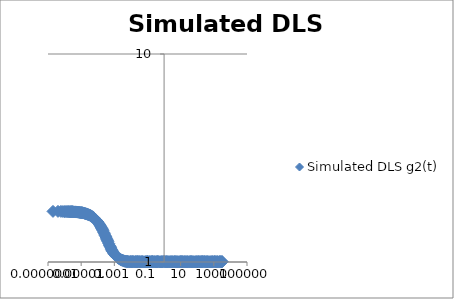
| Category | Simulated DLS g2(t) |
|---|---|
| 0.0 | 1.75 |
| 2e-07 | 1.751 |
| 4e-07 | 1.752 |
| 6e-07 | 1.751 |
| 8e-07 | 1.749 |
| 1e-06 | 1.747 |
| 1.2e-06 | 1.748 |
| 1.4e-06 | 1.747 |
| 1.6e-06 | 1.747 |
| 1.8e-06 | 1.747 |
| 2e-06 | 1.745 |
| 2.2e-06 | 1.744 |
| 2.4e-06 | 1.746 |
| 2.6e-06 | 1.745 |
| 2.8e-06 | 1.745 |
| 3e-06 | 1.744 |
| 3.2e-06 | 1.744 |
| 3.6e-06 | 1.741 |
| 4e-06 | 1.74 |
| 4.4e-06 | 1.741 |
| 4.8e-06 | 1.741 |
| 5.2e-06 | 1.739 |
| 5.6e-06 | 1.739 |
| 6e-06 | 1.738 |
| 6.4e-06 | 1.736 |
| 7.2e-06 | 1.734 |
| 8e-06 | 1.731 |
| 8.8e-06 | 1.729 |
| 9.6e-06 | 1.728 |
| 1.04e-05 | 1.727 |
| 1.12e-05 | 1.726 |
| 1.2e-05 | 1.725 |
| 1.28e-05 | 1.721 |
| 1.44e-05 | 1.719 |
| 1.6e-05 | 1.714 |
| 1.76e-05 | 1.71 |
| 1.92e-05 | 1.706 |
| 2.08e-05 | 1.703 |
| 2.24e-05 | 1.701 |
| 2.4e-05 | 1.696 |
| 2.56e-05 | 1.694 |
| 2.88e-05 | 1.686 |
| 3.2e-05 | 1.681 |
| 3.52e-05 | 1.675 |
| 3.84e-05 | 1.668 |
| 4.16e-05 | 1.661 |
| 4.48e-05 | 1.654 |
| 4.8e-05 | 1.649 |
| 5.12e-05 | 1.641 |
| 5.76e-05 | 1.631 |
| 6.4e-05 | 1.619 |
| 7.04e-05 | 1.606 |
| 7.68e-05 | 1.593 |
| 8.32e-05 | 1.585 |
| 8.96e-05 | 1.574 |
| 9.6e-05 | 1.564 |
| 0.0001024 | 1.554 |
| 0.0001152 | 1.533 |
| 0.000128 | 1.515 |
| 0.0001408 | 1.495 |
| 0.0001536 | 1.476 |
| 0.0001664 | 1.46 |
| 0.0001792 | 1.447 |
| 0.000192 | 1.431 |
| 0.0002048 | 1.415 |
| 0.0002304 | 1.387 |
| 0.000256 | 1.365 |
| 0.0002816 | 1.341 |
| 0.0003072 | 1.321 |
| 0.0003328 | 1.302 |
| 0.0003584 | 1.284 |
| 0.000384 | 1.268 |
| 0.0004096 | 1.253 |
| 0.0004608 | 1.226 |
| 0.000512 | 1.202 |
| 0.0005632 | 1.185 |
| 0.0006144 | 1.169 |
| 0.0006656 | 1.152 |
| 0.0007168 | 1.138 |
| 0.000768 | 1.127 |
| 0.0008192 | 1.117 |
| 0.0009216 | 1.101 |
| 0.001024 | 1.088 |
| 0.0011264 | 1.081 |
| 0.0012288 | 1.071 |
| 0.0013312 | 1.064 |
| 0.0014336 | 1.058 |
| 0.001536 | 1.053 |
| 0.0016384 | 1.049 |
| 0.0018432 | 1.041 |
| 0.002048 | 1.036 |
| 0.0022528 | 1.03 |
| 0.0024576 | 1.027 |
| 0.0026624 | 1.022 |
| 0.0028672 | 1.021 |
| 0.003072 | 1.02 |
| 0.0032768 | 1.017 |
| 0.0036864 | 1.014 |
| 0.004096 | 1.009 |
| 0.0045056 | 1.007 |
| 0.0049152 | 1.008 |
| 0.0053248 | 1.006 |
| 0.0057344 | 1.004 |
| 0.006144 | 1.005 |
| 0.0065536 | 1.004 |
| 0.0073728 | 1.004 |
| 0.008192 | 1.002 |
| 0.0090112 | 1.004 |
| 0.0098304 | 1.004 |
| 0.0106496 | 1.002 |
| 0.0114688 | 1.003 |
| 0.012288 | 1.004 |
| 0.0131072 | 1.003 |
| 0.0147456 | 1.004 |
| 0.016384 | 1.001 |
| 0.0180224 | 1.003 |
| 0.0196608 | 1.005 |
| 0.0212992 | 1.003 |
| 0.0229376 | 1.002 |
| 0.024576 | 1.004 |
| 0.0262144 | 1.003 |
| 0.0294912 | 1.004 |
| 0.032768 | 1.004 |
| 0.0360448 | 1.001 |
| 0.0393216 | 1.003 |
| 0.0425984 | 1.003 |
| 0.0458752 | 1.003 |
| 0.049152 | 1.004 |
| 0.0528384 | 1.003 |
| 0.059392 | 1.002 |
| 0.0659456 | 1.001 |
| 0.0724992 | 1.003 |
| 0.0790528 | 1.002 |
| 0.0856064 | 1.003 |
| 0.09216 | 1.004 |
| 0.0987136 | 1.004 |
| 0.105267 | 1.003 |
| 0.118374 | 1.003 |
| 0.131482 | 1.004 |
| 0.144589 | 1.002 |
| 0.157696 | 1.003 |
| 0.170803 | 1.003 |
| 0.18391 | 1.005 |
| 0.197018 | 1.005 |
| 0.210125 | 1.003 |
| 0.236339 | 1.003 |
| 0.262554 | 1.004 |
| 0.288768 | 1.002 |
| 0.314982 | 1.001 |
| 0.341197 | 1.004 |
| 0.367411 | 1.001 |
| 0.393626 | 1.004 |
| 0.41984 | 1.004 |
| 0.472269 | 1.004 |
| 0.524698 | 1.002 |
| 0.577126 | 1.001 |
| 0.629555 | 1.002 |
| 0.681984 | 1.004 |
| 0.734413 | 1.001 |
| 0.786842 | 1.001 |
| 0.83927 | 1.004 |
| 0.944128 | 1.005 |
| 1.04899 | 1.005 |
| 1.15384 | 1.004 |
| 1.2587 | 1.002 |
| 1.36356 | 1.004 |
| 1.46842 | 1.002 |
| 1.57327 | 1.003 |
| 1.67813 | 1.002 |
| 1.88785 | 1.003 |
| 2.09756 | 1.002 |
| 2.30728 | 1.002 |
| 2.51699 | 1.003 |
| 2.72671 | 1.003 |
| 2.93642 | 1.002 |
| 3.14614 | 1.001 |
| 3.35585 | 1.004 |
| 3.77528 | 1.002 |
| 4.19471 | 1.005 |
| 4.61414 | 1.002 |
| 5.03357 | 1.004 |
| 5.453 | 1.002 |
| 5.872439999999999 | 1.003 |
| 6.29187 | 1.001 |
| 6.7113 | 1.002 |
| 7.55016 | 1.002 |
| 8.38902 | 1.002 |
| 9.227879999999997 | 1.004 |
| 10.0667 | 1.004 |
| 10.9056 | 1.003 |
| 11.7445 | 1.004 |
| 12.5833 | 1.003 |
| 13.4222 | 1.003 |
| 15.0999 | 1.002 |
| 16.7776 | 1.004 |
| 18.4553 | 1.001 |
| 20.1331 | 1.003 |
| 21.8108 | 1.002 |
| 23.4885 | 1.003 |
| 25.1662 | 1.003 |
| 26.844 | 1.002 |
| 30.1994 | 1.002 |
| 33.5548 | 1.003 |
| 36.9103 | 1.003 |
| 40.2657 | 1.005 |
| 43.6212 | 1.003 |
| 46.9766 | 1.004 |
| 50.3321 | 1.002 |
| 53.6875 | 1.003 |
| 60.3984 | 1.003 |
| 67.1093 | 1.002 |
| 73.8202 | 1.002 |
| 80.531 | 1.003 |
| 87.2419 | 1.002 |
| 93.9528 | 1.004 |
| 100.664 | 1.002 |
| 107.375 | 1.002 |
| 120.796 | 1.005 |
| 134.218 | 1.003 |
| 147.64 | 1.003 |
| 161.062 | 1.002 |
| 174.483 | 1.004 |
| 187.905 | 1.003 |
| 201.327 | 1.003 |
| 214.749 | 1.005 |
| 241.592 | 1.004 |
| 268.436 | 1.005 |
| 295.279 | 1.003 |
| 322.123 | 1.002 |
| 348.967 | 1.003 |
| 375.81 | 1.002 |
| 402.654 | 1.004 |
| 429.497 | 1.003 |
| 483.184 | 1.003 |
| 536.871 | 1.002 |
| 590.558 | 1.002 |
| 644.246 | 1.002 |
| 697.933 | 1.003 |
| 751.62 | 1.001 |
| 805.307 | 1.003 |
| 858.994 | 1.004 |
| 966.368 | 1.002 |
| 1073.74 | 1.005 |
| 1181.12 | 1.004 |
| 1288.49 | 1.002 |
| 1395.86 | 1.002 |
| 1503.24 | 1.002 |
| 1610.61 | 1.004 |
| 1717.99 | 1.002 |
| 1932.74 | 1.001 |
| 2147.48 | 1.004 |
| 2362.23 | 1.004 |
| 2576.98 | 1.004 |
| 2791.73 | 1.002 |
| 3006.48 | 1.003 |
| 3221.23 | 1.004 |